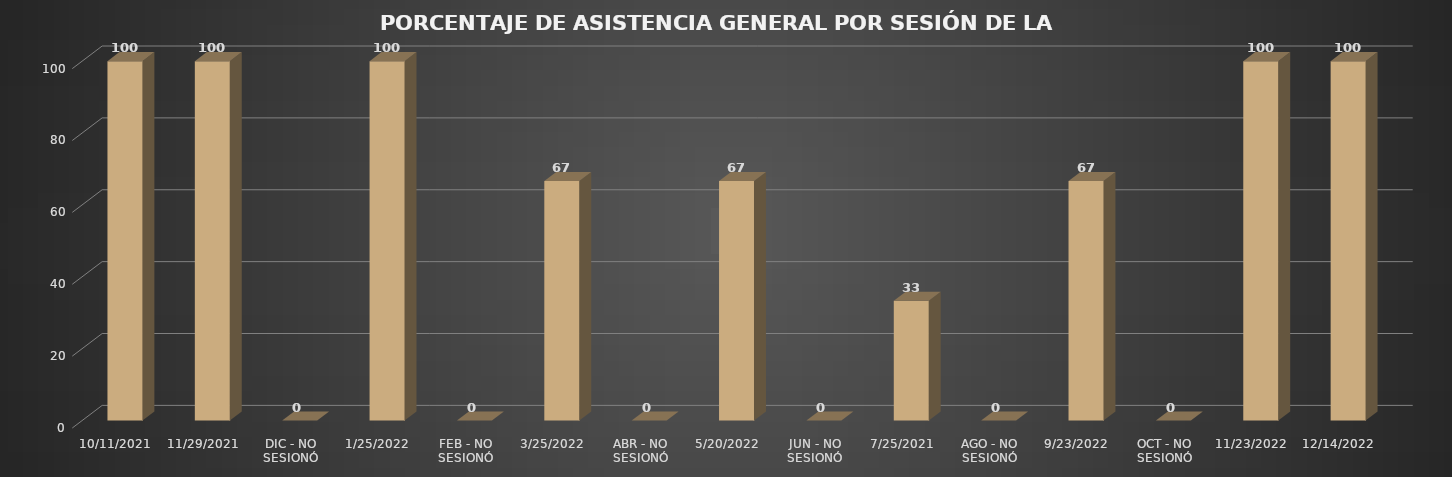
| Category | Series 0 |
|---|---|
| 11/10/2021 | 100 |
| 29/11/2021 | 100 |
| DIC - NO SESIONÓ | 0 |
| 25/01/2022 | 100 |
| FEB - NO SESIONÓ | 0 |
| 25/03/2022 | 66.667 |
| ABR - NO SESIONÓ | 0 |
| 20/05/2022 | 66.667 |
| JUN - NO SESIONÓ | 0 |
| 25/07/2021 | 33.333 |
| AGO - NO SESIONÓ | 0 |
| 23/09/2022 | 66.667 |
| OCT - NO SESIONÓ | 0 |
| 23/11/2022 | 100 |
| 14/12/2022 | 100 |